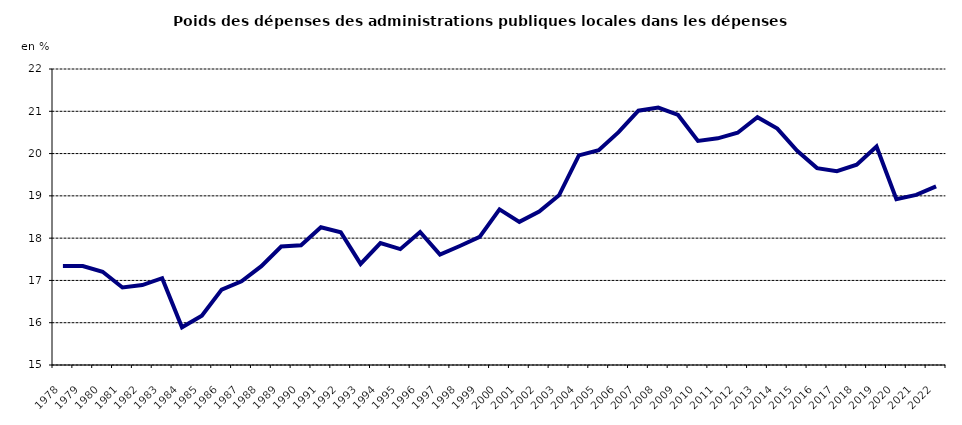
| Category | poids des dépenses des administarations publiques locales dans les administrations publiques |
|---|---|
| 1978.0 | 17.339 |
| 1979.0 | 17.341 |
| 1980.0 | 17.205 |
| 1981.0 | 16.834 |
| 1982.0 | 16.891 |
| 1983.0 | 17.054 |
| 1984.0 | 15.892 |
| 1985.0 | 16.168 |
| 1986.0 | 16.782 |
| 1987.0 | 16.979 |
| 1988.0 | 17.336 |
| 1989.0 | 17.802 |
| 1990.0 | 17.83 |
| 1991.0 | 18.256 |
| 1992.0 | 18.141 |
| 1993.0 | 17.39 |
| 1994.0 | 17.882 |
| 1995.0 | 17.74 |
| 1996.0 | 18.145 |
| 1997.0 | 17.609 |
| 1998.0 | 17.814 |
| 1999.0 | 18.03 |
| 2000.0 | 18.679 |
| 2001.0 | 18.384 |
| 2002.0 | 18.63 |
| 2003.0 | 19.013 |
| 2004.0 | 19.956 |
| 2005.0 | 20.078 |
| 2006.0 | 20.507 |
| 2007.0 | 21.014 |
| 2008.0 | 21.088 |
| 2009.0 | 20.914 |
| 2010.0 | 20.299 |
| 2011.0 | 20.36 |
| 2012.0 | 20.493 |
| 2013.0 | 20.86 |
| 2014.0 | 20.59 |
| 2015.0 | 20.065 |
| 2016.0 | 19.656 |
| 2017.0 | 19.585 |
| 2018.0 | 19.735 |
| 2019.0 | 20.169 |
| 2020.0 | 18.923 |
| 2021.0 | 19.022 |
| 2022.0 | 19.226 |